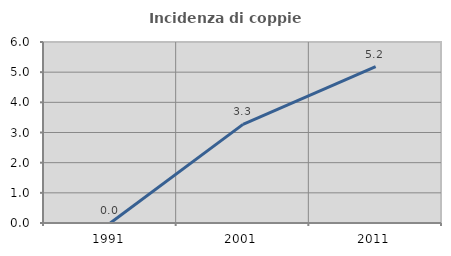
| Category | Incidenza di coppie miste |
|---|---|
| 1991.0 | 0 |
| 2001.0 | 3.268 |
| 2011.0 | 5.18 |